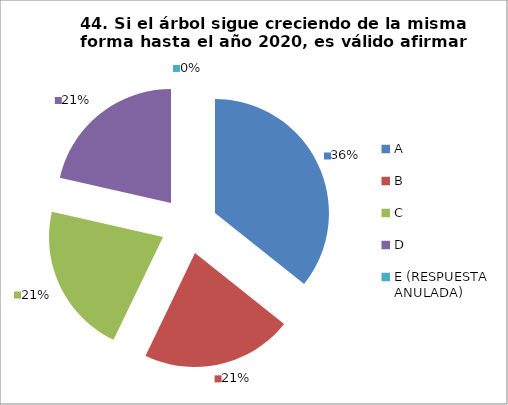
| Category | CANTIDAD DE RESPUESTAS PREGUNTA (44) | PORCENTAJE |
|---|---|---|
| A | 10 | 0.357 |
| B | 6 | 0.214 |
| C | 6 | 0.214 |
| D | 6 | 0.214 |
| E (RESPUESTA ANULADA) | 0 | 0 |